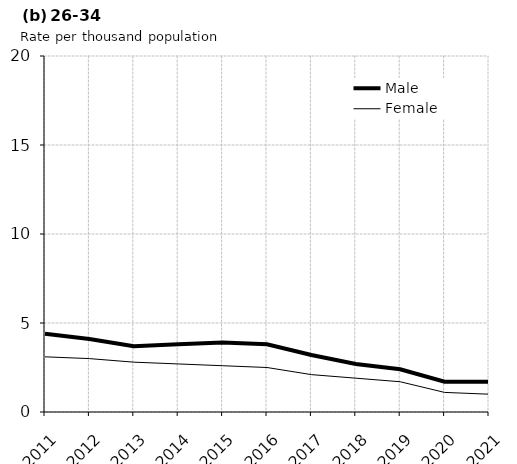
| Category | Male | Female |
|---|---|---|
| 2011.0 | 4.4 | 3.1 |
| 2012.0 | 4.1 | 3 |
| 2013.0 | 3.7 | 2.8 |
| 2014.0 | 3.8 | 2.7 |
| 2015.0 | 3.9 | 2.6 |
| 2016.0 | 3.8 | 2.5 |
| 2017.0 | 3.2 | 2.1 |
| 2018.0 | 2.7 | 1.9 |
| 2019.0 | 2.4 | 1.7 |
| 2020.0 | 1.7 | 1.1 |
| 2021.0 | 1.7 | 1 |